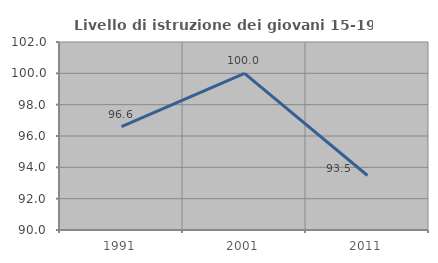
| Category | Livello di istruzione dei giovani 15-19 anni |
|---|---|
| 1991.0 | 96.591 |
| 2001.0 | 100 |
| 2011.0 | 93.478 |